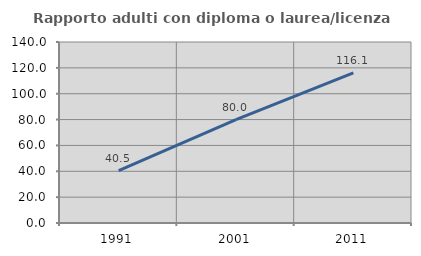
| Category | Rapporto adulti con diploma o laurea/licenza media  |
|---|---|
| 1991.0 | 40.488 |
| 2001.0 | 80 |
| 2011.0 | 116.137 |